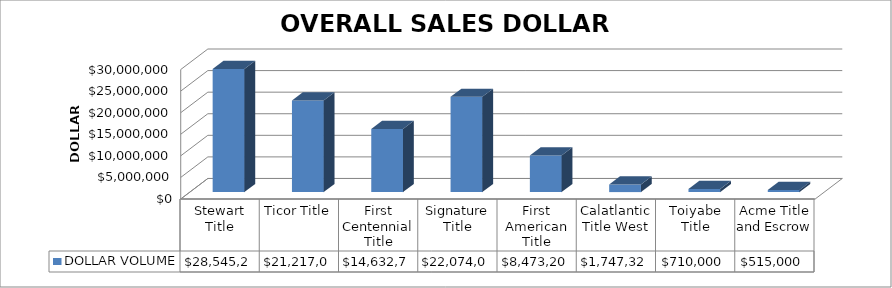
| Category | DOLLAR VOLUME |
|---|---|
| Stewart Title | 28545235 |
| Ticor Title | 21217016.5 |
| First Centennial Title | 14632748 |
| Signature Title | 22074000 |
| First American Title | 8473205 |
| Calatlantic Title West | 1747326 |
| Toiyabe Title | 710000 |
| Acme Title and Escrow | 515000 |